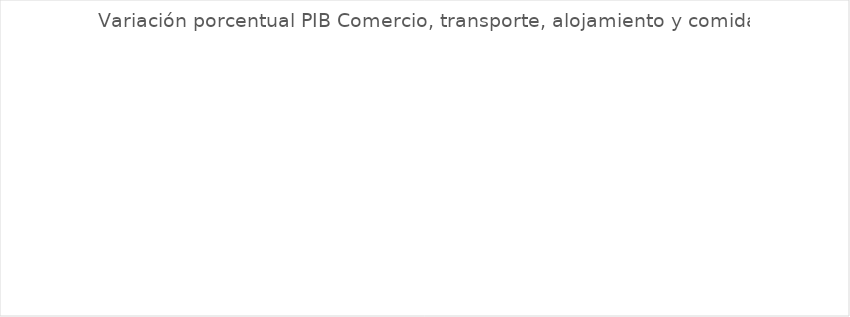
| Category | Variación porcentual PIB Comercio, transporte, alojamiento y comida |
|---|---|
| Casanare | -8.029 |
| Atlántico | -10.541 |
| Arauca | -11.515 |
| Risaralda | -12.216 |
| Nariño | -12.281 |
| Cundinamarca | -12.481 |
| Antioquia | -12.921 |
| Valle del Cauca | -13.139 |
| Caldas | -13.707 |
| Quindío | -13.994 |
| Santander | -14.265 |
| Huila | -14.548 |
| Meta | -14.649 |
| Bogotá D.C. | -14.749 |
| COLOMBIA | -15.156 |
| Boyacá | -17.369 |
| Norte de Santander | -17.614 |
| Tolima | -18.143 |
| Córdoba | -18.203 |
| Cesar | -19.248 |
| Magdalena | -19.71 |
| Sucre | -20.017 |
| Putumayo | -20.608 |
| Caquetá | -21.8 |
| Cauca | -23.561 |
| Vaupés | -23.959 |
| Guainía | -23.998 |
| La Guajira | -25.38 |
| Chocó | -26 |
| Vichada | -26.766 |
| Guaviare | -27.746 |
| Amazonas | -28.979 |
| Bolívar | -30.198 |
| San Andrés, Providencia y Santa Catalina (Archipiélago) | -36.252 |